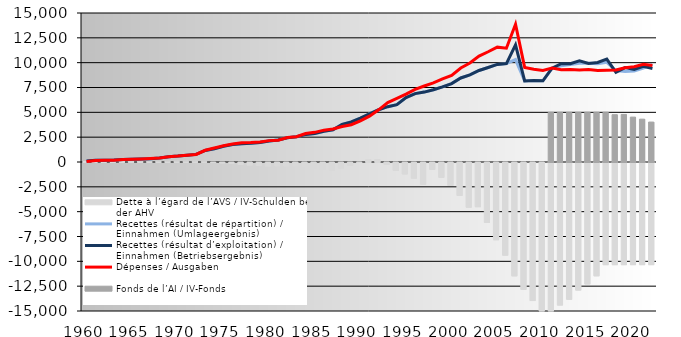
| Category | Dette à l’égard de l’AVS / IV-Schulden bei der AHV |
|---|---|
| 1960.0 | 49.048 |
| 1961.0 | 61.958 |
| 1962.0 | 79.242 |
| 1963.0 | 98.158 |
| 1964.0 | 96.304 |
| 1965.0 | 96.232 |
| 1966.0 | 88.49 |
| 1967.0 | 68.227 |
| 1968.0 | 71.178 |
| 1969.0 | 72.41 |
| 1970.0 | 75.47 |
| 1971.0 | 79.247 |
| 1972.0 | 86.532 |
| 1973.0 | 66.334 |
| 1974.0 | -8.286 |
| 1975.0 | -57.443 |
| 1976.0 | -103.885 |
| 1977.0 | -188.835 |
| 1978.0 | -259.304 |
| 1979.0 | -315.893 |
| 1980.0 | -356.234 |
| 1981.0 | -334.57 |
| 1982.0 | -357.253 |
| 1983.0 | -360.697 |
| 1984.0 | -468.177 |
| 1985.0 | -576.063 |
| 1986.0 | -686.746 |
| 1987.0 | -769.526 |
| 1988.0 | -550.95 |
| 1989.0 | -272.468 |
| 1990.0 | 5.997 |
| 1991.0 | 228.758 |
| 1992.0 | 240.002 |
| 1993.0 | -179.853 |
| 1994.0 | -805.177 |
| 1995.0 | -1148.076 |
| 1996.0 | -1574.973 |
| 1997.0 | -2190.12 |
| 1998.0 | -685.876 |
| 1999.0 | -1485.019 |
| 2000.0 | -2305.507 |
| 2001.0 | -3313.026 |
| 2002.0 | -4502.516 |
| 2003.0 | -4450.381 |
| 2004.0 | -6035.927 |
| 2005.0 | -7773.774 |
| 2006.0 | -9330.14 |
| 2007.0 | -11410.899 |
| 2008.0 | -12773.228 |
| 2009.0 | -13899.312 |
| 2010.0 | -14943.83 |
| 2011.0 | -14943.83 |
| 2012.0 | -14351.568 |
| 2013.0 | -13765.374 |
| 2014.0 | -12843.04 |
| 2015.0 | -12229.422 |
| 2016.0 | -11406.234 |
| 2017.0 | -10284.204 |
| 2018.0 | -10284.204 |
| 2019.0 | -10284.204 |
| 2020.0 | -10284.204 |
| 2021.0 | -10284.204 |